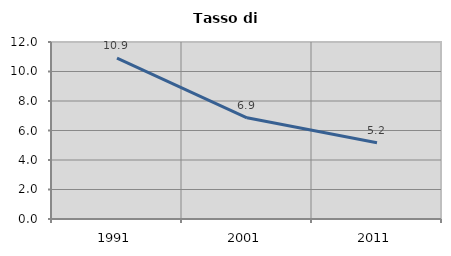
| Category | Tasso di disoccupazione   |
|---|---|
| 1991.0 | 10.906 |
| 2001.0 | 6.862 |
| 2011.0 | 5.167 |